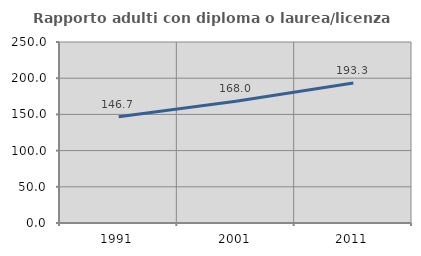
| Category | Rapporto adulti con diploma o laurea/licenza media  |
|---|---|
| 1991.0 | 146.681 |
| 2001.0 | 168.022 |
| 2011.0 | 193.261 |